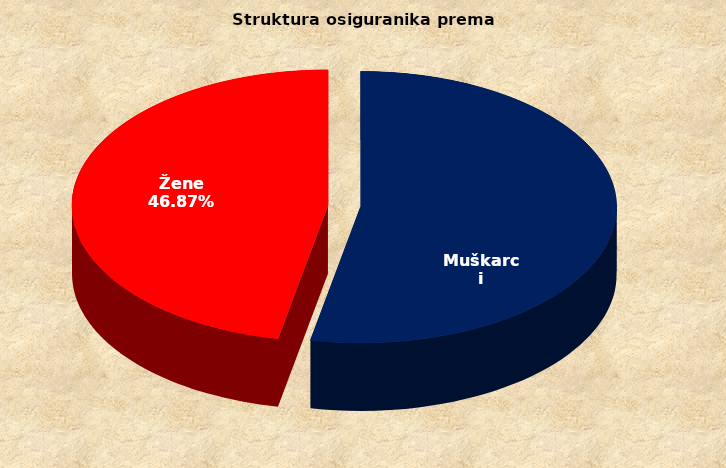
| Category | Series 0 |
|---|---|
| Muškarci | 898671 |
| Žene | 792895 |